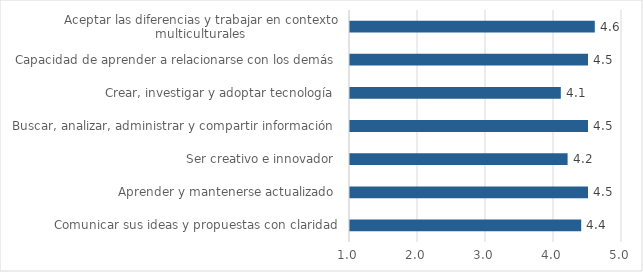
| Category | Series 5 | Promedio |
|---|---|---|
| Comunicar sus ideas y propuestas con claridad |  | 4.4 |
| Aprender y mantenerse actualizado  |  | 4.5 |
| Ser creativo e innovador  |  | 4.2 |
| Buscar, analizar, administrar y compartir información  |  | 4.5 |
| Crear, investigar y adoptar tecnología  |  | 4.1 |
| Capacidad de aprender a relacionarse con los demás  |  | 4.5 |
| Aceptar las diferencias y trabajar en contexto multiculturales  |  | 4.6 |